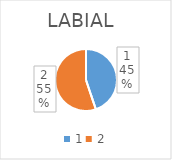
| Category | LABIAL  |
|---|---|
| 0 | 26726 |
| 1 | 32870 |